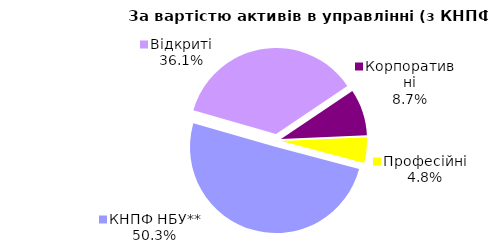
| Category | Series 0 |
|---|---|
| Відкриті | 991.538 |
| Корпоративні | 239.869 |
| Професійні | 132.731 |
| КНПФ НБУ** | 1381.063 |